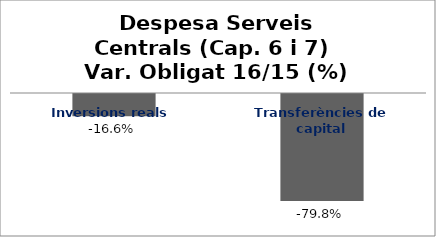
| Category | Series 0 |
|---|---|
| Inversions reals | -0.166 |
| Transferències de capital | -0.798 |